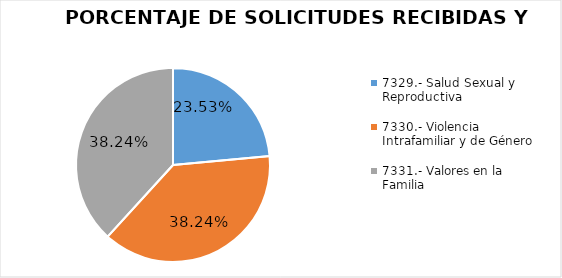
| Category | Series 0 |
|---|---|
| 7329.- Salud Sexual y Reproductiva | 0.235 |
| 7330.- Violencia Intrafamiliar y de Género | 0.382 |
| 7331.- Valores en la Familia | 0.382 |